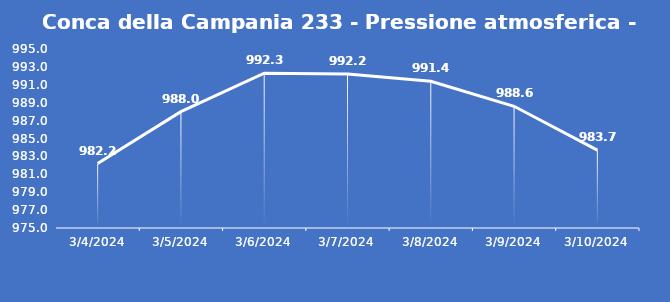
| Category | Conca della Campania 233 - Pressione atmosferica - Grezzo (hPa) |
|---|---|
| 3/4/24 | 982.2 |
| 3/5/24 | 988 |
| 3/6/24 | 992.3 |
| 3/7/24 | 992.2 |
| 3/8/24 | 991.4 |
| 3/9/24 | 988.6 |
| 3/10/24 | 983.7 |